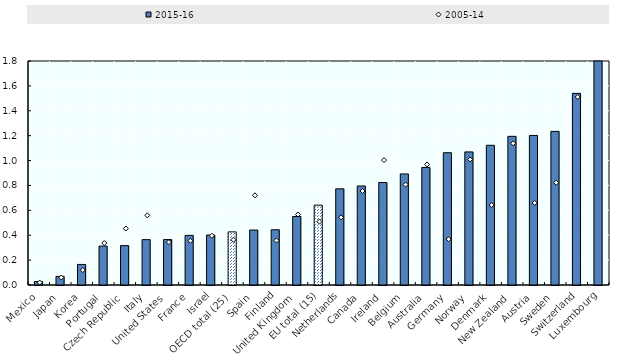
| Category | 2015-16 |
|---|---|
| Mexico | 0.028 |
| Japan | 0.069 |
| Korea | 0.165 |
| Portugal | 0.313 |
| Czech Republic | 0.317 |
| Italy | 0.364 |
| United States | 0.365 |
| France | 0.399 |
| Israel | 0.402 |
| OECD total (25) | 0.427 |
| Spain | 0.442 |
| Finland | 0.444 |
| United Kingdom | 0.55 |
| EU total (15) | 0.642 |
| Netherlands | 0.773 |
| Canada | 0.796 |
| Ireland | 0.824 |
| Belgium | 0.893 |
| Australia | 0.945 |
| Germany | 1.063 |
| Norway | 1.069 |
| Denmark | 1.123 |
| New Zealand | 1.195 |
| Austria | 1.202 |
| Sweden | 1.234 |
| Switzerland | 1.54 |
| Luxembourg | 3.435 |